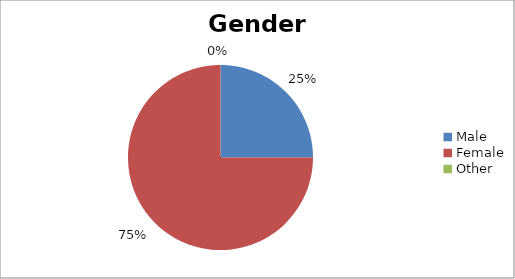
| Category | Gender |
|---|---|
| Male | 1 |
| Female | 3 |
| Other | 0 |